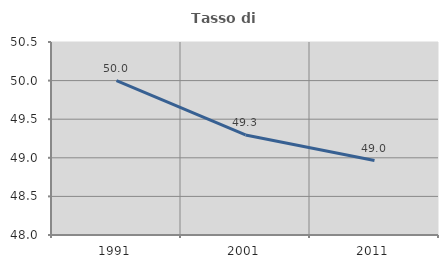
| Category | Tasso di occupazione   |
|---|---|
| 1991.0 | 50 |
| 2001.0 | 49.296 |
| 2011.0 | 48.964 |